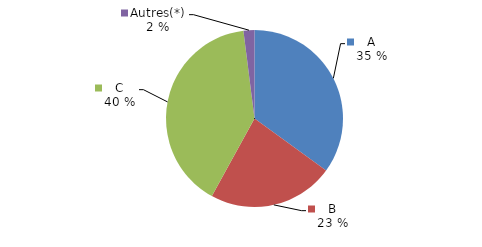
| Category | Series 0 |
|---|---|
| A | 0.35 |
| B | 0.23 |
| C | 0.4 |
| Autres(*) | 0.02 |